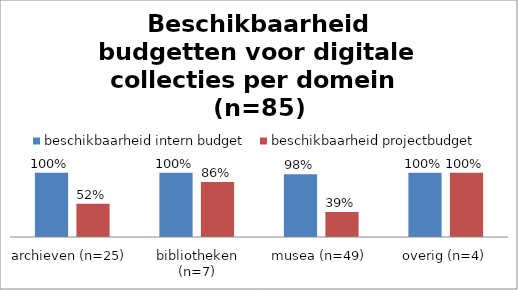
| Category | beschikbaarheid intern budget | beschikbaarheid projectbudget |
|---|---|---|
| archieven (n=25) | 1 | 0.52 |
| bibliotheken (n=7) | 1 | 0.857 |
| musea (n=49) | 0.98 | 0.388 |
| overig (n=4) | 1 | 1 |